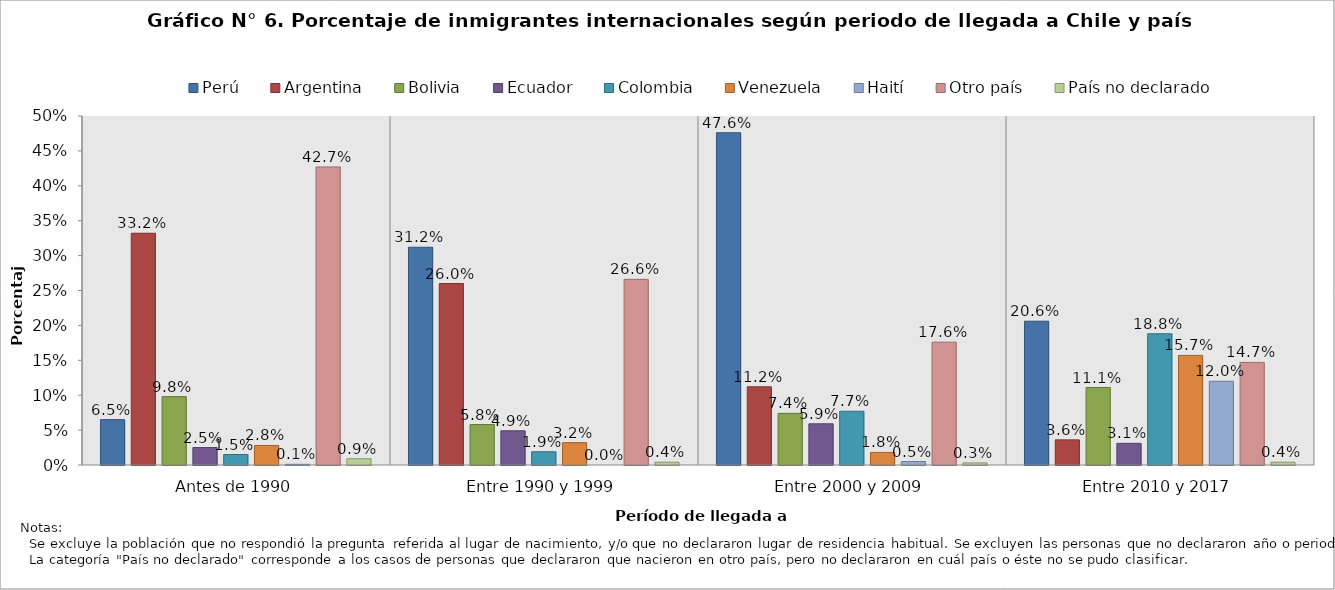
| Category | Perú | Argentina | Bolivia | Ecuador | Colombia | Venezuela | Haití | Otro país | País no declarado |
|---|---|---|---|---|---|---|---|---|---|
| Antes de 1990 | 0.065 | 0.332 | 0.098 | 0.025 | 0.015 | 0.028 | 0.001 | 0.427 | 0.009 |
| Entre 1990 y 1999 | 0.312 | 0.26 | 0.058 | 0.049 | 0.019 | 0.032 | 0 | 0.266 | 0.004 |
| Entre 2000 y 2009 | 0.476 | 0.112 | 0.074 | 0.059 | 0.077 | 0.018 | 0.005 | 0.176 | 0.003 |
| Entre 2010 y 2017 | 0.206 | 0.036 | 0.111 | 0.031 | 0.188 | 0.157 | 0.12 | 0.147 | 0.004 |